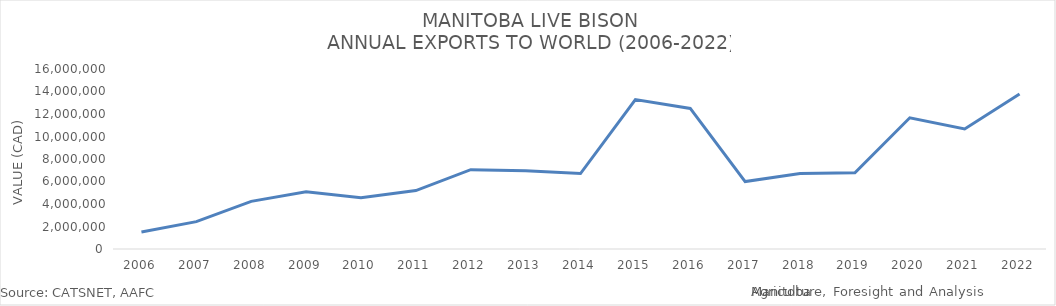
| Category | Series 0 |
|---|---|
| 2006 | 1508666 |
| 2007 | 2430720 |
| 2008 | 4232272 |
| 2009 | 5087321 |
| 2010 | 4548081 |
| 2011 | 5195558 |
| 2012 | 7050200 |
| 2013 | 6964087 |
| 2014 | 6707854 |
| 2015 | 13277735 |
| 2016 | 12497612 |
| 2017 | 5990814 |
| 2018 | 6720514 |
| 2019 | 6774640 |
| 2020 | 11665598 |
| 2021 | 10671712 |
| 2022 | 13784011 |